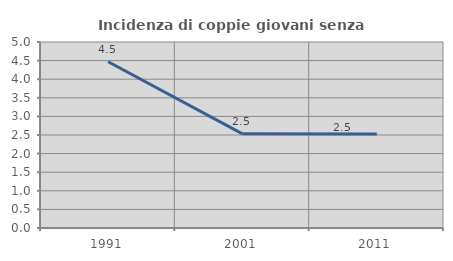
| Category | Incidenza di coppie giovani senza figli |
|---|---|
| 1991.0 | 4.47 |
| 2001.0 | 2.532 |
| 2011.0 | 2.525 |